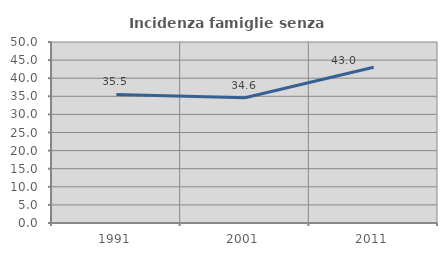
| Category | Incidenza famiglie senza nuclei |
|---|---|
| 1991.0 | 35.507 |
| 2001.0 | 34.601 |
| 2011.0 | 43.019 |